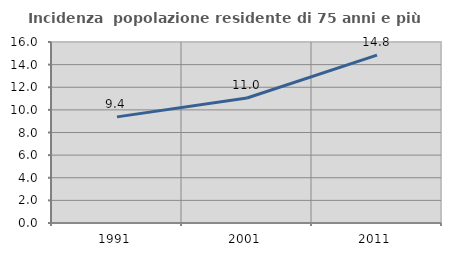
| Category | Incidenza  popolazione residente di 75 anni e più |
|---|---|
| 1991.0 | 9.382 |
| 2001.0 | 11.047 |
| 2011.0 | 14.841 |